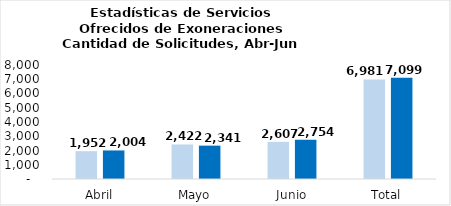
| Category | Tramitadas |
|---|---|
| Abril | 2004 |
| Mayo | 2341 |
| Junio | 2754 |
| Total | 7099 |